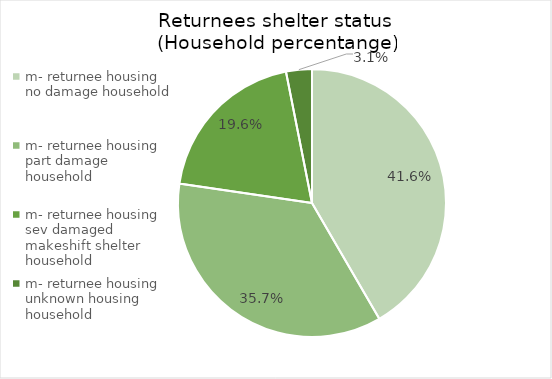
| Category | Series 0 |
|---|---|
| m- returnee housing no damage household | 0.416 |
| m- returnee housing part damage household | 0.357 |
| m- returnee housing sev damaged makeshift shelter household | 0.196 |
| m- returnee housing unknown housing household | 0.031 |